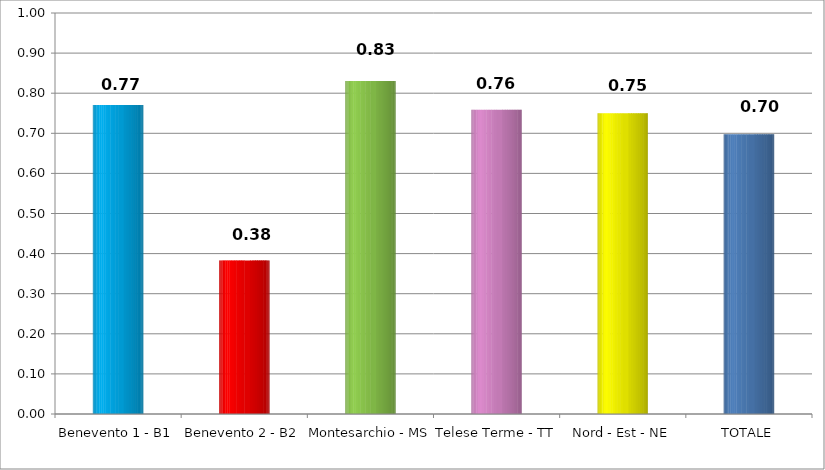
| Category | Series 0 |
|---|---|
| Benevento 1 - B1 | 0.771 |
| Benevento 2 - B2 | 0.383 |
| Montesarchio - MS | 0.831 |
| Telese Terme - TT | 0.758 |
| Nord - Est - NE | 0.75 |
| TOTALE | 0.697 |